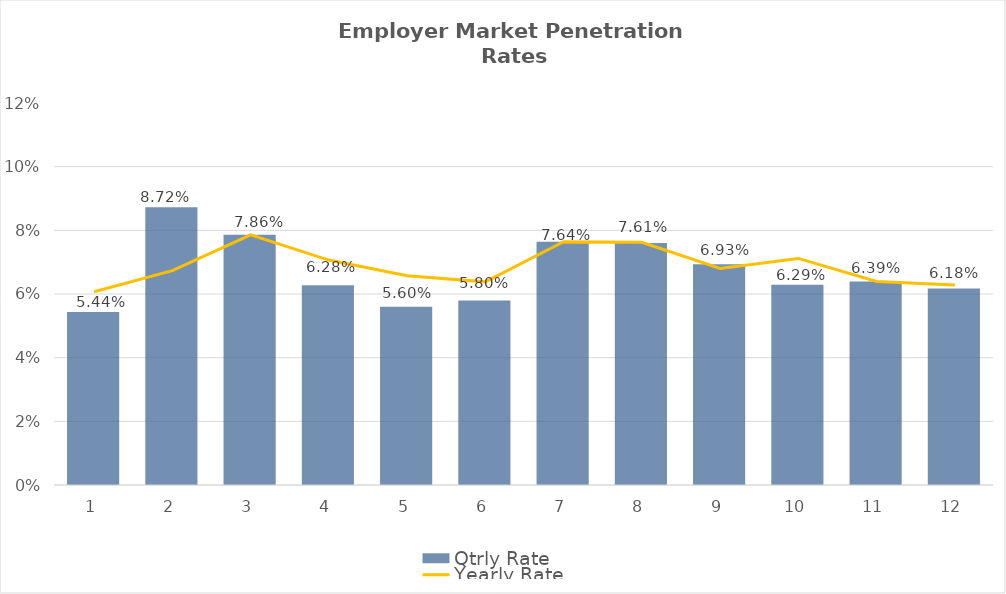
| Category | Qtrly Rate |
|---|---|
| 0 | 0.054 |
| 1 | 0.087 |
| 2 | 0.079 |
| 3 | 0.063 |
| 4 | 0.056 |
| 5 | 0.058 |
| 6 | 0.076 |
| 7 | 0.076 |
| 8 | 0.069 |
| 9 | 0.063 |
| 10 | 0.064 |
| 11 | 0.062 |